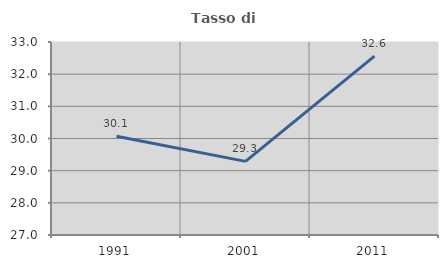
| Category | Tasso di occupazione   |
|---|---|
| 1991.0 | 30.07 |
| 2001.0 | 29.289 |
| 2011.0 | 32.562 |